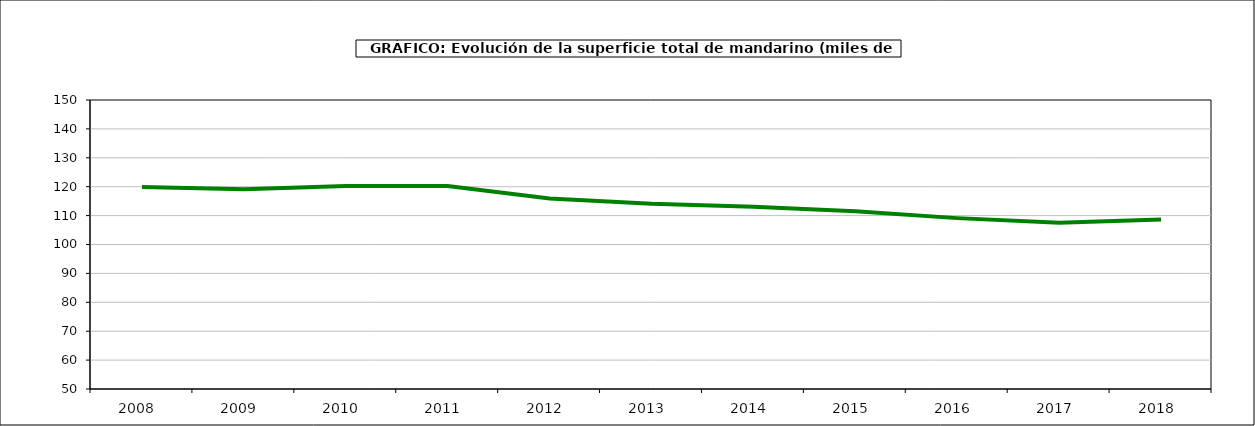
| Category | superficie |
|---|---|
| 2008.0 | 119.875 |
| 2009.0 | 119.154 |
| 2010.0 | 120.256 |
| 2011.0 | 120.212 |
| 2012.0 | 115.927 |
| 2013.0 | 114.076 |
| 2014.0 | 113.102 |
| 2015.0 | 111.467 |
| 2016.0 | 109.127 |
| 2017.0 | 107.515 |
| 2018.0 | 108.613 |